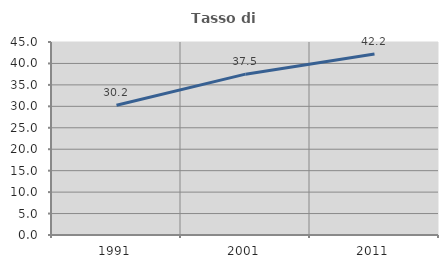
| Category | Tasso di occupazione   |
|---|---|
| 1991.0 | 30.242 |
| 2001.0 | 37.5 |
| 2011.0 | 42.194 |